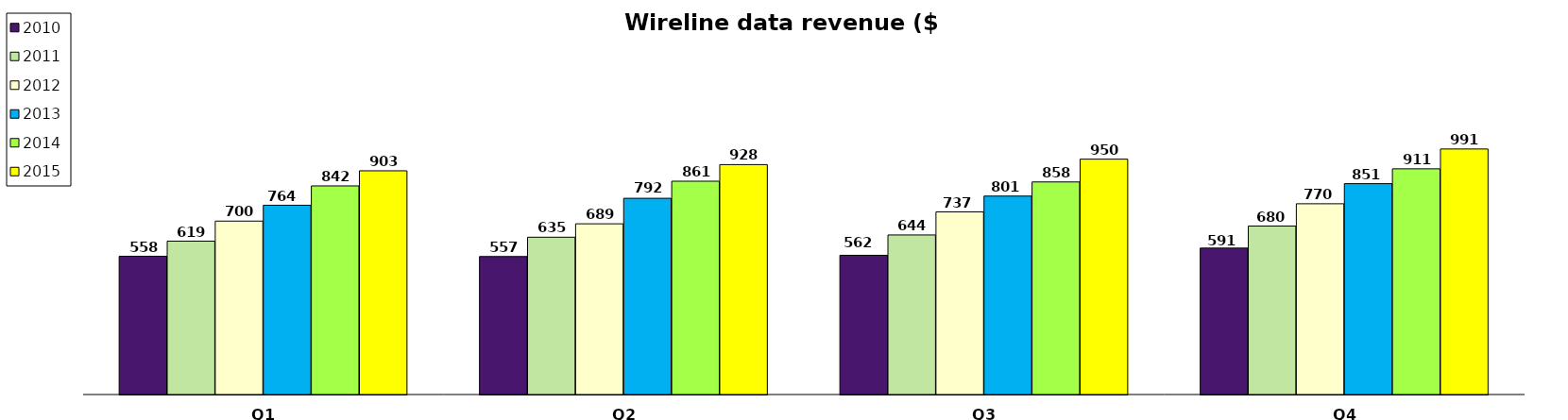
| Category | 2010 | 2011 | 2012 | 2013 | 2014 | 2015 |
|---|---|---|---|---|---|---|
| Q1 | 558 | 619 | 700 | 764 | 842 | 903 |
| Q2 | 557 | 635 | 689 | 792 | 861 | 928 |
| Q3 | 562 | 644 | 737 | 801 | 858 | 950 |
| Q4 | 591 | 680 | 770 | 851 | 911 | 991 |